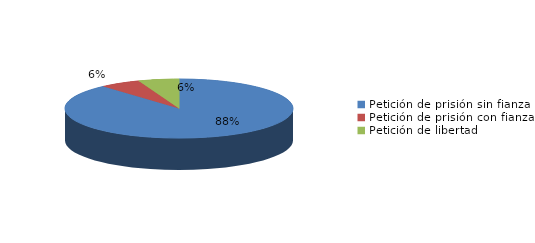
| Category | Series 0 |
|---|---|
| Petición de prisión sin fianza | 123 |
| Petición de prisión con fianza | 8 |
| Petición de libertad | 8 |